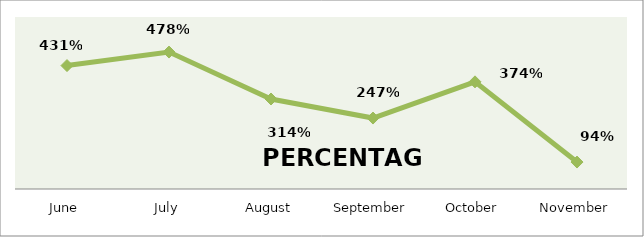
| Category | PERCENTAGE |
|---|---|
| June | 4.306 |
| July | 4.777 |
| August | 3.14 |
| September | 2.475 |
| October | 3.738 |
| November | 0.94 |